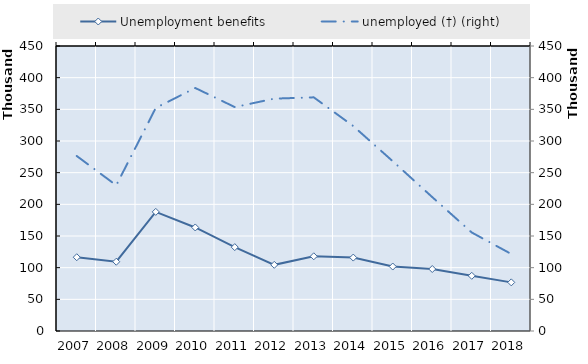
| Category | Unemployment benefits |
|---|---|
| 2007.0 | 116477.792 |
| 2008.0 | 109375.542 |
| 2009.0 | 188068.875 |
| 2010.0 | 163480.875 |
| 2011.0 | 132420.708 |
| 2012.0 | 104471.583 |
| 2013.0 | 117946.292 |
| 2014.0 | 115908.208 |
| 2015.0 | 101789 |
| 2016.0 | 97870 |
| 2017.0 | 87130 |
| 2018.0 | 76792 |